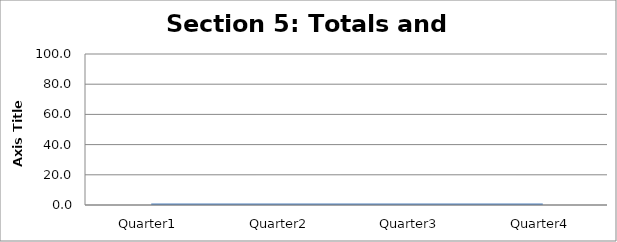
| Category | Section 5: Totals and Compliance |
|---|---|
| Quarter1 | 0 |
| Quarter2 | 0 |
| Quarter3 | 0 |
| Quarter4 | 0 |